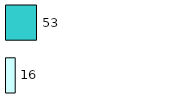
| Category | Series 0 | Series 1 |
|---|---|---|
| 0 | 16 | 53 |